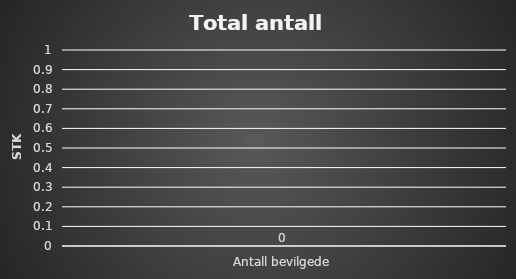
| Category | Series 0 |
|---|---|
| Antall bevilgede | 0 |